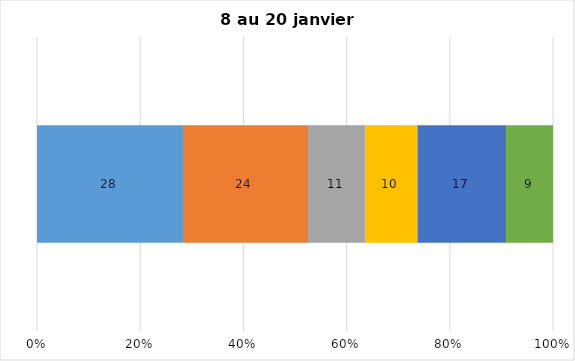
| Category | Plusieurs fois par jour | Une fois par jour | Quelques fois par semaine   | Une fois par semaine ou moins   |  Jamais   |  Je n’utilise pas les médias sociaux |
|---|---|---|---|---|---|---|
| 0 | 28 | 24 | 11 | 10 | 17 | 9 |